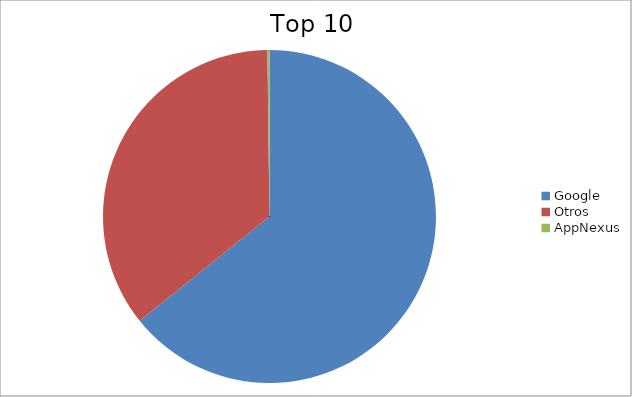
| Category | Series 0 |
|---|---|
| Google | 64.23 |
| Otros | 35.57 |
| AppNexus | 0.2 |